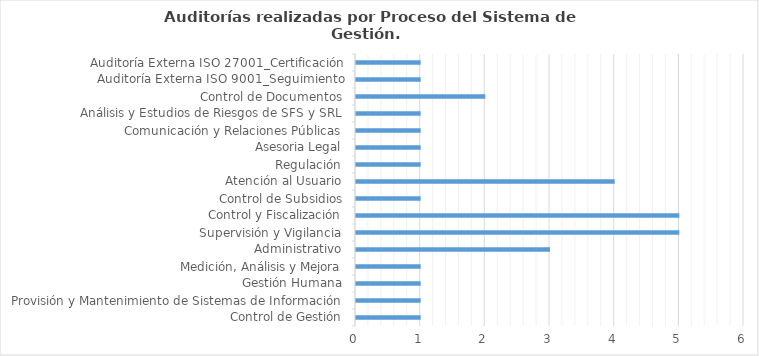
| Category | Total |
|---|---|
| Control de Gestión | 1 |
| Provisión y Mantenimiento de Sistemas de Información | 1 |
| Gestión Humana | 1 |
| Medición, Análisis y Mejora | 1 |
| Administrativo | 3 |
| Supervisión y Vigilancia | 5 |
| Control y Fiscalización | 5 |
| Control de Subsidios | 1 |
| Atención al Usuario | 4 |
| Regulación | 1 |
| Asesoria Legal | 1 |
| Comunicación y Relaciones Públicas | 1 |
| Análisis y Estudios de Riesgos de SFS y SRL | 1 |
| Control de Documentos | 2 |
| Auditoría Externa ISO 9001_Seguimiento | 1 |
| Auditoría Externa ISO 27001_Certificación | 1 |